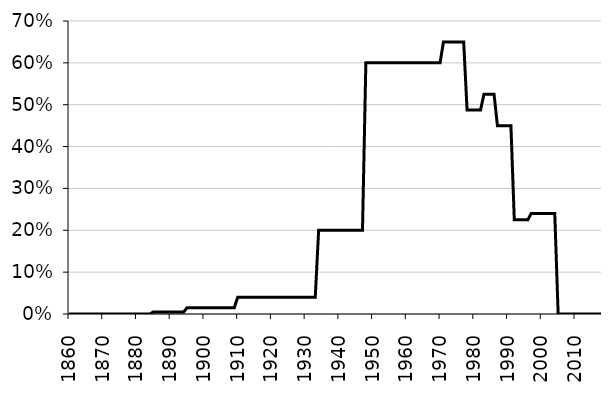
| Category | Foundation CFE |
|---|---|
| 1860.0 | 0 |
| 1861.0 | 0 |
| 1862.0 | 0 |
| 1863.0 | 0 |
| 1864.0 | 0 |
| 1865.0 | 0 |
| 1866.0 | 0 |
| 1867.0 | 0 |
| 1868.0 | 0 |
| 1869.0 | 0 |
| 1870.0 | 0 |
| 1871.0 | 0 |
| 1872.0 | 0 |
| 1873.0 | 0 |
| 1874.0 | 0 |
| 1875.0 | 0 |
| 1876.0 | 0 |
| 1877.0 | 0 |
| 1878.0 | 0 |
| 1879.0 | 0 |
| 1880.0 | 0 |
| 1881.0 | 0 |
| 1882.0 | 0 |
| 1883.0 | 0 |
| 1884.0 | 0 |
| 1885.0 | 0.5 |
| 1886.0 | 0.5 |
| 1887.0 | 0.5 |
| 1888.0 | 0.5 |
| 1889.0 | 0.5 |
| 1890.0 | 0.5 |
| 1891.0 | 0.5 |
| 1892.0 | 0.5 |
| 1893.0 | 0.5 |
| 1894.0 | 0.5 |
| 1895.0 | 1.5 |
| 1896.0 | 1.5 |
| 1897.0 | 1.5 |
| 1898.0 | 1.5 |
| 1899.0 | 1.5 |
| 1900.0 | 1.5 |
| 1901.0 | 1.5 |
| 1902.0 | 1.5 |
| 1903.0 | 1.5 |
| 1904.0 | 1.5 |
| 1905.0 | 1.5 |
| 1906.0 | 1.5 |
| 1907.0 | 1.5 |
| 1908.0 | 1.5 |
| 1909.0 | 1.5 |
| 1910.0 | 4 |
| 1911.0 | 4 |
| 1912.0 | 4 |
| 1913.0 | 4 |
| 1914.0 | 4 |
| 1915.0 | 4 |
| 1916.0 | 4 |
| 1917.0 | 4 |
| 1918.0 | 4 |
| 1919.0 | 4 |
| 1920.0 | 4 |
| 1921.0 | 4 |
| 1922.0 | 4 |
| 1923.0 | 4 |
| 1924.0 | 4 |
| 1925.0 | 4 |
| 1926.0 | 4 |
| 1927.0 | 4 |
| 1928.0 | 4 |
| 1929.0 | 4 |
| 1930.0 | 4 |
| 1931.0 | 4 |
| 1932.0 | 4 |
| 1933.0 | 4 |
| 1934.0 | 20 |
| 1935.0 | 20 |
| 1936.0 | 20 |
| 1937.0 | 20 |
| 1938.0 | 20 |
| 1939.0 | 20 |
| 1940.0 | 20 |
| 1941.0 | 20 |
| 1942.0 | 20 |
| 1943.0 | 20 |
| 1944.0 | 20 |
| 1945.0 | 20 |
| 1946.0 | 20 |
| 1947.0 | 20 |
| 1948.0 | 60 |
| 1949.0 | 60 |
| 1950.0 | 60 |
| 1951.0 | 60 |
| 1952.0 | 60 |
| 1953.0 | 60 |
| 1954.0 | 60 |
| 1955.0 | 60 |
| 1956.0 | 60 |
| 1957.0 | 60 |
| 1958.0 | 60 |
| 1959.0 | 60 |
| 1960.0 | 60 |
| 1961.0 | 60 |
| 1962.0 | 60 |
| 1963.0 | 60 |
| 1964.0 | 60 |
| 1965.0 | 60 |
| 1966.0 | 60 |
| 1967.0 | 60 |
| 1968.0 | 60 |
| 1969.0 | 60 |
| 1970.0 | 60 |
| 1971.0 | 65 |
| 1972.0 | 65 |
| 1973.0 | 65 |
| 1974.0 | 65 |
| 1975.0 | 65 |
| 1976.0 | 65 |
| 1977.0 | 65 |
| 1978.0 | 48.75 |
| 1979.0 | 48.75 |
| 1980.0 | 48.75 |
| 1981.0 | 48.75 |
| 1982.0 | 48.75 |
| 1983.0 | 52.5 |
| 1984.0 | 52.5 |
| 1985.0 | 52.5 |
| 1986.0 | 52.5 |
| 1987.0 | 45 |
| 1988.0 | 45 |
| 1989.0 | 45 |
| 1990.0 | 45 |
| 1991.0 | 45 |
| 1992.0 | 22.5 |
| 1993.0 | 22.5 |
| 1994.0 | 22.5 |
| 1995.0 | 22.5 |
| 1996.0 | 22.5 |
| 1997.0 | 24 |
| 1998.0 | 24 |
| 1999.0 | 24 |
| 2000.0 | 24 |
| 2001.0 | 24 |
| 2002.0 | 24 |
| 2003.0 | 24 |
| 2004.0 | 24 |
| 2005.0 | 0 |
| 2006.0 | 0 |
| 2007.0 | 0 |
| 2008.0 | 0 |
| 2009.0 | 0 |
| 2010.0 | 0 |
| 2011.0 | 0 |
| 2012.0 | 0 |
| 2013.0 | 0 |
| 2014.0 | 0 |
| 2015.0 | 0 |
| 2016.0 | 0 |
| 2017.0 | 0 |
| 2018.0 | 0 |